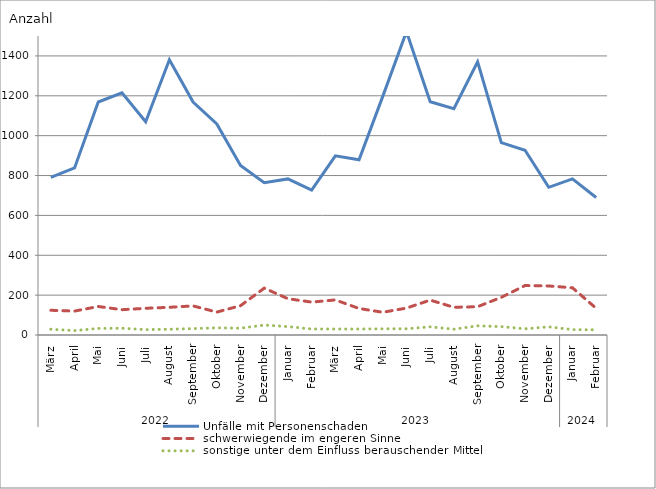
| Category | Unfälle mit Personenschaden | schwerwiegende im engeren Sinne | sonstige unter dem Einfluss berauschender Mittel |
|---|---|---|---|
| 0 | 791 | 124 | 29 |
| 1 | 838 | 120 | 22 |
| 2 | 1169 | 143 | 33 |
| 3 | 1215 | 127 | 34 |
| 4 | 1070 | 134 | 27 |
| 5 | 1381 | 139 | 29 |
| 6 | 1169 | 146 | 32 |
| 7 | 1059 | 115 | 36 |
| 8 | 850 | 147 | 34 |
| 9 | 764 | 235 | 50 |
| 10 | 783 | 182 | 42 |
| 11 | 727 | 165 | 30 |
| 12 | 899 | 176 | 30 |
| 13 | 879 | 133 | 30 |
| 14 | 1197 | 114 | 31 |
| 15 | 1522 | 135 | 31 |
| 16 | 1170 | 175 | 41 |
| 17 | 1135 | 139 | 29 |
| 18 | 1371 | 142 | 46 |
| 19 | 965 | 189 | 42 |
| 20 | 927 | 248 | 31 |
| 21 | 741 | 246 | 41 |
| 22 | 783 | 237 | 27 |
| 23 | 690 | 134 | 26 |